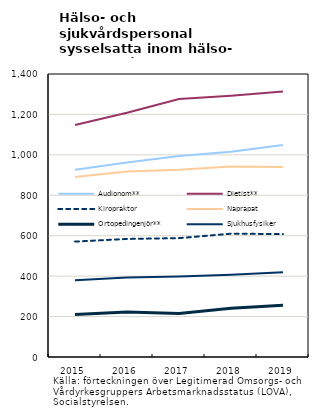
| Category | Audionom** | Dietist** | Kiropraktor | Naprapat | Ortopedingenjör** | Sjukhusfysiker |
|---|---|---|---|---|---|---|
| 2015.0 | 926 | 1148 | 571 | 891 | 210 | 380 |
| 2016.0 | 962 | 1208 | 584 | 918 | 222 | 393 |
| 2017.0 | 994 | 1276 | 588 | 926 | 215 | 398 |
| 2018.0 | 1015 | 1292 | 610 | 942 | 241 | 407 |
| 2019.0 | 1049 | 1313 | 608 | 940 | 256 | 419 |